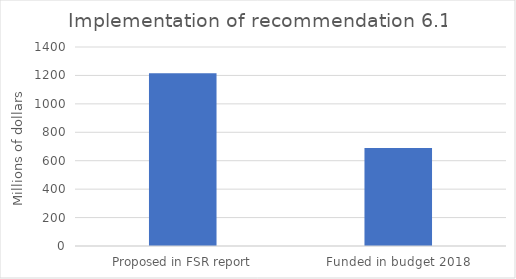
| Category | Series 0 |
|---|---|
| Proposed in FSR report | 1215 |
| Funded in budget 2018 | 690 |